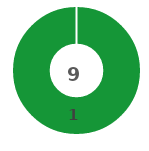
| Category | Series 0 |
|---|---|
| 0 | 1 |
| 1 | 0 |
| 2 | 0 |
| 3 | 0 |
| 4 | 0 |